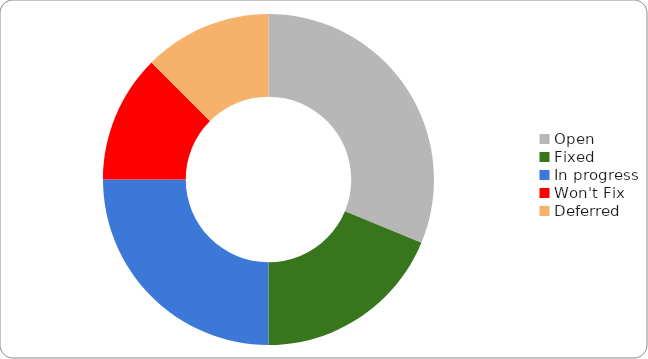
| Category | Series 0 |
|---|---|
| Open | 5 |
| Fixed | 3 |
| In progress | 4 |
| Won't Fix | 2 |
| Deferred | 2 |